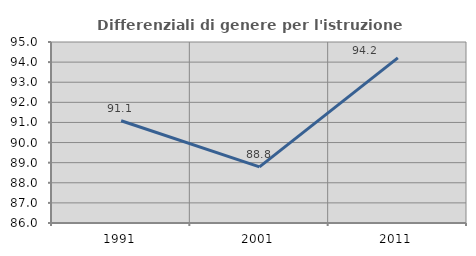
| Category | Differenziali di genere per l'istruzione superiore |
|---|---|
| 1991.0 | 91.083 |
| 2001.0 | 88.788 |
| 2011.0 | 94.212 |